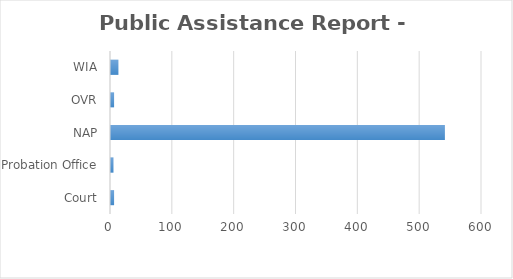
| Category | Series 0 |
|---|---|
| Court | 5 |
| Probation Office | 4 |
| NAP | 540 |
| OVR | 5 |
| WIA | 12 |